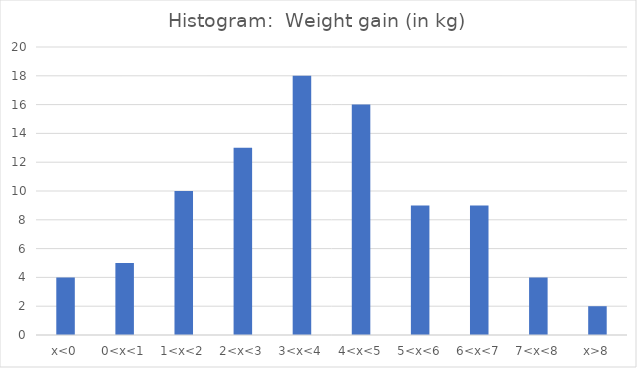
| Category | Series 0 |
|---|---|
| x<0 | 4 |
| 0<x<1 | 5 |
| 1<x<2 | 10 |
| 2<x<3 | 13 |
| 3<x<4 | 18 |
| 4<x<5 | 16 |
| 5<x<6 | 9 |
| 6<x<7 | 9 |
| 7<x<8 | 4 |
| x>8 | 2 |